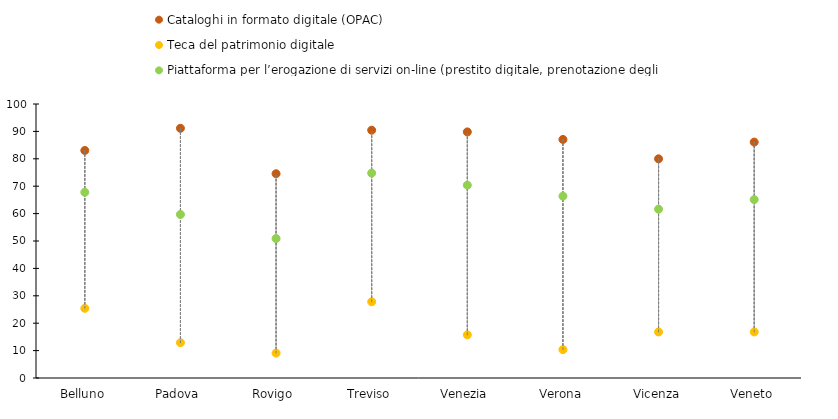
| Category | Cataloghi in formato digitale (OPAC) | Teca del patrimonio digitale | Piattaforma per l’erogazione di servizi on-line (prestito digitale, prenotazione degli accessi, delle postazioni o di documenti) |
|---|---|---|---|
| Belluno | 83.051 | 25.424 | 67.797 |
| Padova | 91.129 | 12.903 | 59.677 |
| Rovigo | 74.545 | 9.091 | 50.909 |
| Treviso | 90.435 | 27.826 | 74.783 |
| Venezia | 89.815 | 15.741 | 70.37 |
| Verona | 87.069 | 10.345 | 66.379 |
| Vicenza | 80 | 16.8 | 61.6 |
| Veneto | 86.1 | 16.8 | 65.1 |